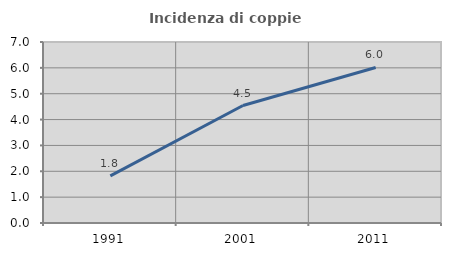
| Category | Incidenza di coppie miste |
|---|---|
| 1991.0 | 1.823 |
| 2001.0 | 4.542 |
| 2011.0 | 6.014 |